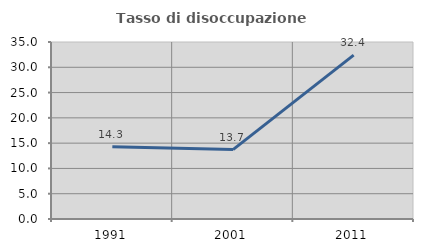
| Category | Tasso di disoccupazione giovanile  |
|---|---|
| 1991.0 | 14.286 |
| 2001.0 | 13.725 |
| 2011.0 | 32.394 |